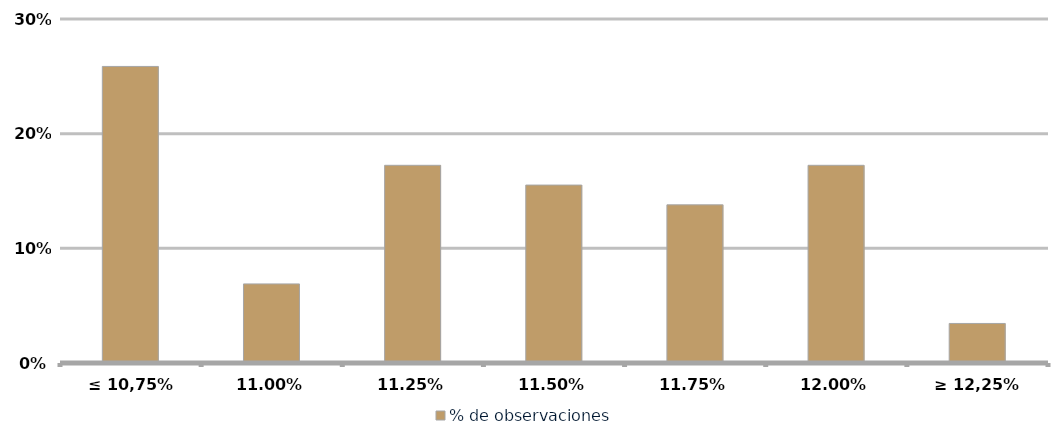
| Category | % de observaciones  |
|---|---|
| ≤ 10,75% | 0.259 |
| 11,00% | 0.069 |
| 11,25% | 0.172 |
| 11,50% | 0.155 |
| 11,75% | 0.138 |
| 12,00% | 0.172 |
| ≥ 12,25% | 0.034 |